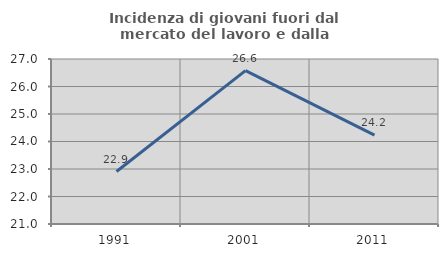
| Category | Incidenza di giovani fuori dal mercato del lavoro e dalla formazione  |
|---|---|
| 1991.0 | 22.908 |
| 2001.0 | 26.578 |
| 2011.0 | 24.232 |